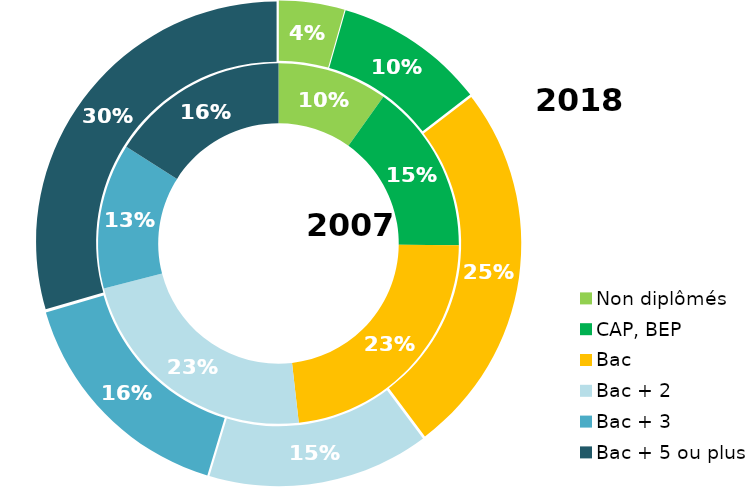
| Category | 2007 | 2018 |
|---|---|---|
| Non diplômés | 9.88 | 4.41 |
| CAP, BEP | 15.28 | 10.13 |
| Bac | 23.05 | 25.24 |
| Bac + 2 | 22.79 | 14.89 |
| Bac + 3 | 13.03 | 15.83 |
| Bac + 5 ou plus | 15.98 | 29.51 |